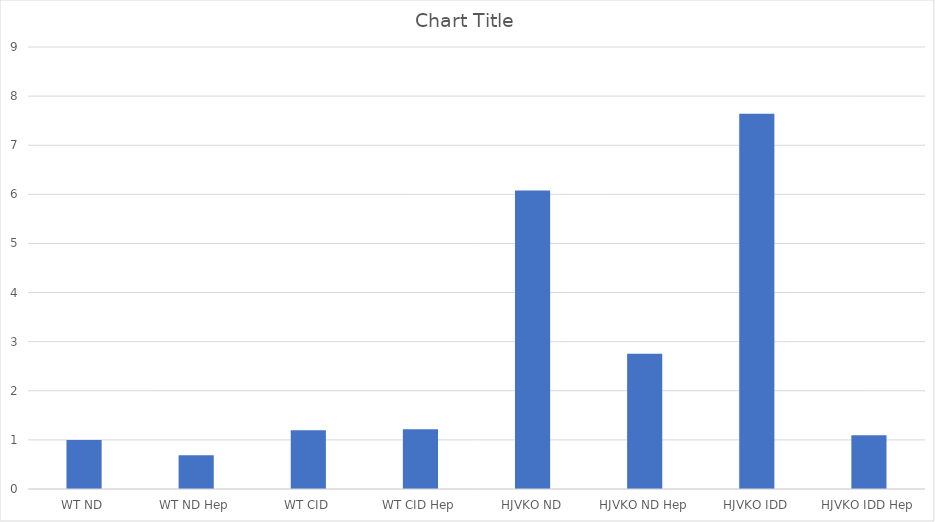
| Category | Series 0 |
|---|---|
| WT ND | 1 |
| WT ND Hep | 0.686 |
| WT CID | 1.198 |
| WT CID Hep | 1.217 |
| HJVKO ND | 6.08 |
| HJVKO ND Hep | 2.752 |
| HJVKO IDD | 7.643 |
| HJVKO IDD Hep | 1.095 |